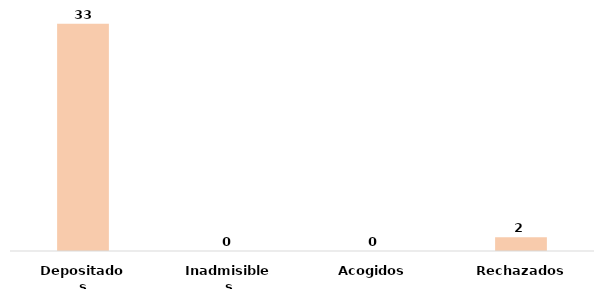
| Category | Series 0 |
|---|---|
| Depositados | 33 |
| Inadmisibles | 0 |
| Acogidos | 0 |
| Rechazados | 2 |